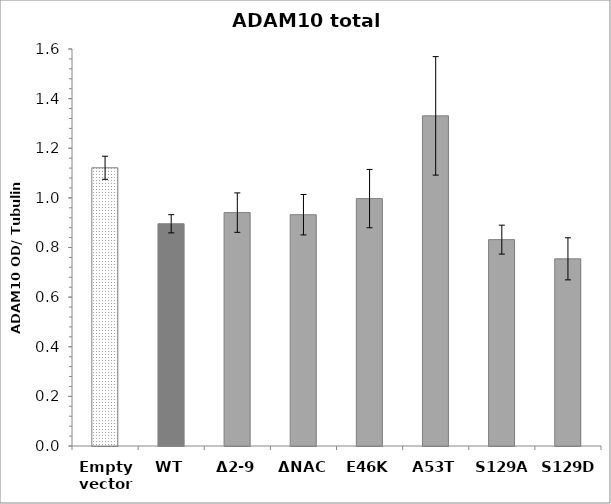
| Category | Series 0 |
|---|---|
| Empty vector | 1.121 |
| WT | 0.896 |
| Δ2-9 | 0.941 |
| ΔNAC | 0.932 |
| E46K | 0.997 |
| A53T | 1.331 |
| S129A | 0.832 |
| S129D | 0.754 |